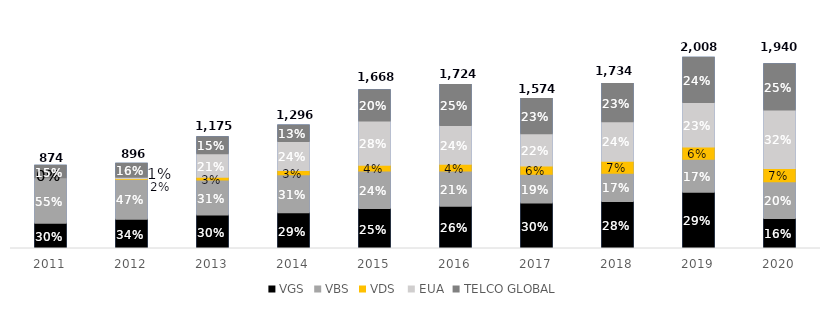
| Category | Valid Consolidado |
|---|---|
| 2011.0 | 873.922 |
| 2012.0 | 896.476 |
| 2013.0 | 1175.097 |
| 2014.0 | 1296.059 |
| 2015.0 | 1668.293 |
| 2016.0 | 1723.85 |
| 2017.0 | 1574.474 |
| 2018.0 | 1734.312 |
| 2019.0 | 2007.936 |
| 2020.0 | 1939.843 |